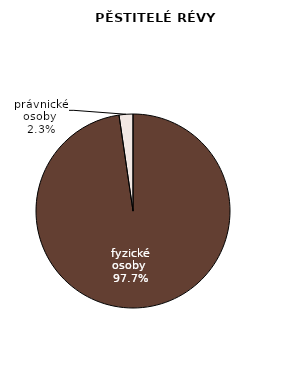
| Category | Series 0 |
|---|---|
| fyzické osoby  | 16159 |
| právnické osoby  | 382 |